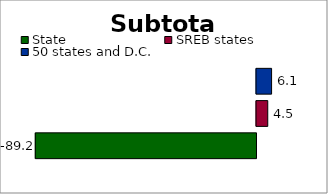
| Category | State | SREB states | 50 states and D.C. |
|---|---|---|---|
| 0 | -89.172 | 4.547 | 6.098 |